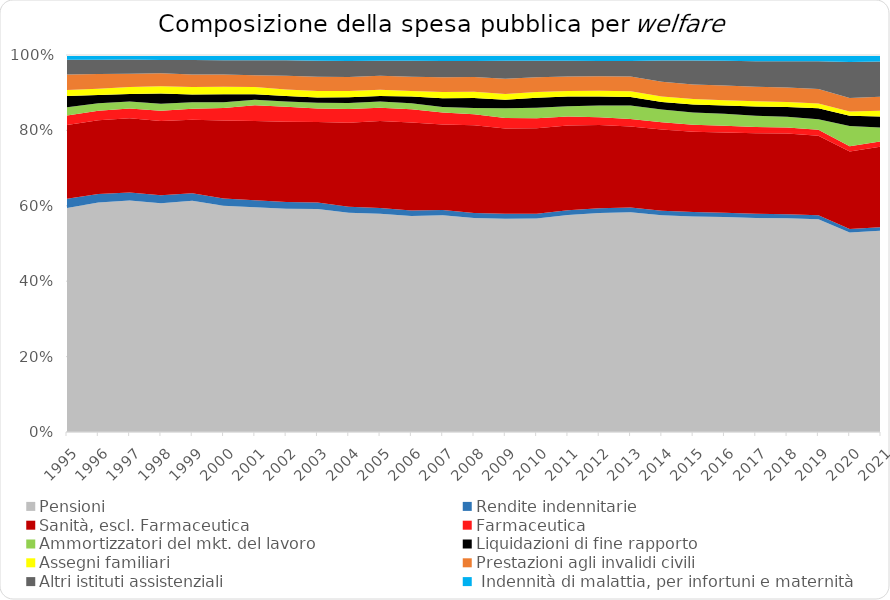
| Category | Pensioni | Rendite indennitarie | Sanità, escl. Farmaceutica | Farmaceutica  | Ammortizzatori del mkt. del lavoro | Liquidazioni di fine rapporto | Assegni familiari | Prestazioni agli invalidi civili  | Altri istituti assistenziali |  Indennità di malattia, per infortuni e maternità |
|---|---|---|---|---|---|---|---|---|---|---|
| 1995.0 | 119940 | 4998 | 39539 | 4995 | 4451 | 6067 | 3144 | 8370 | 7828 | 2576 |
| 1996.0 | 132235 | 4998 | 42519 | 5469 | 4268 | 4844 | 3604 | 8386 | 8253 | 2759 |
| 1997.0 | 143651 | 4998 | 46046 | 6016 | 4320 | 4654 | 4287 | 8266 | 8789 | 2857 |
| 1998.0 | 145595 | 4998 | 47293 | 6629 | 4390 | 6462 | 4641 | 8237 | 8473 | 3196 |
| 1999.0 | 154187 | 4998 | 49052 | 7372 | 4270 | 5153 | 5015 | 8399 | 9574 | 3384 |
| 2000.0 | 158323 | 5038 | 54641 | 8743 | 3960 | 5602 | 5254 | 8625 | 9953 | 3635 |
| 2001.0 | 165954 | 5160 | 58524 | 11661 | 4013 | 4205 | 5375 | 8590 | 11132 | 3833 |
| 2002.0 | 174145 | 5178 | 62502 | 11722 | 4220 | 4168 | 5126 | 10653 | 12141 | 4086 |
| 2003.0 | 181325 | 5370 | 65375 | 11096 | 4541 | 4393 | 5294 | 11595 | 12853 | 4765 |
| 2004.0 | 188962 | 5174 | 72270 | 11988 | 5075 | 4954 | 5471 | 12100 | 13706 | 5184 |
| 2005.0 | 195953 | 5123 | 78047 | 11849 | 5624 | 5021 | 5406 | 12723 | 13351 | 5213 |
| 2006.0 | 202634 | 5140 | 82517 | 12334 | 5795 | 6181 | 5317 | 13363 | 14880 | 5467 |
| 2007.0 | 210550 | 5172 | 83008 | 11543 | 5393 | 8597 | 6095 | 14287 | 15802 | 5780 |
| 2008.0 | 219092 | 5121 | 89729 | 11226 | 6401 | 10314 | 6363 | 15118 | 16509 | 6033 |
| 2009.0 | 227590 | 5491 | 91116 | 10997 | 10472 | 8980 | 6299 | 16190 | 19210 | 6212 |
| 2010.0 | 233490 | 5156 | 93534 | 10913 | 11407 | 11205 | 6039 | 16374 | 18022 | 6186 |
| 2011.0 | 239803 | 5213 | 93688 | 9862 | 11426 | 10661 | 6279 | 15898 | 17305 | 6475 |
| 2012.0 | 245052 | 5416 | 92998 | 8905 | 13119 | 10052 | 6417 | 16309 | 17000 | 6665 |
| 2013.0 | 250327 | 5325 | 92426 | 8616 | 15150 | 9899 | 6462 | 16787 | 17650 | 6817 |
| 2014.0 | 252059 | 5305 | 94326 | 8392 | 14745 | 8860 | 6412 | 17068 | 24669 | 6464 |
| 2015.0 | 254144 | 5225 | 94677 | 8245 | 14326 | 9486 | 6313 | 17187 | 28412 | 6406 |
| 2016.0 | 256079 | 5089 | 95715 | 8100 | 14181 | 9839 | 6446 | 17386 | 29665 | 6755 |
| 2017.0 | 258730 | 5059 | 97244 | 7624 | 13419 | 11300 | 6443 | 17522 | 30812 | 7465 |
| 2018.0 | 263698 | 4970 | 99723 | 7566 | 13119 | 11966 | 6267 | 17922 | 32255 | 7823 |
| 2019.0 | 270141 | 4890 | 100920 | 7581 | 13316 | 14056 | 6024 | 18465 | 35216 | 7942 |
| 2020.0 | 276606 | 4772 | 107725 | 7290 | 27850 | 14306 | 5721 | 18860 | 49786 | 9846 |
| 2021.0 | 282077 | 4851 | 112772 | 7344 | 19579 | 15336 | 8041 | 19718 | 49234 | 9165 |